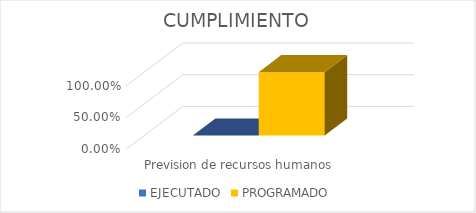
| Category | EJECUTADO | PROGRAMADO |
|---|---|---|
| Prevision de recursos humanos  | 0 | 1 |